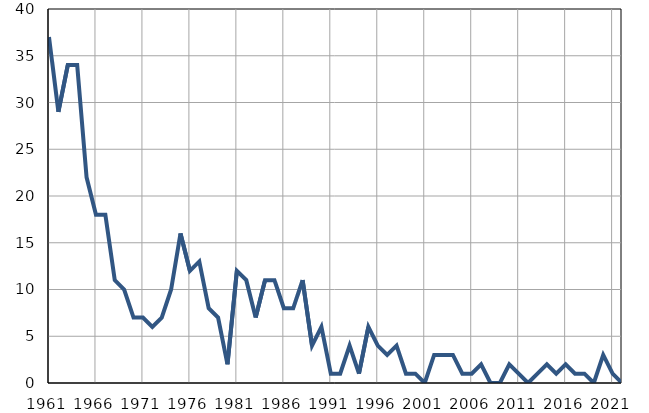
| Category | Умрла 
одојчад |
|---|---|
| 1961.0 | 37 |
| 1962.0 | 29 |
| 1963.0 | 34 |
| 1964.0 | 34 |
| 1965.0 | 22 |
| 1966.0 | 18 |
| 1967.0 | 18 |
| 1968.0 | 11 |
| 1969.0 | 10 |
| 1970.0 | 7 |
| 1971.0 | 7 |
| 1972.0 | 6 |
| 1973.0 | 7 |
| 1974.0 | 10 |
| 1975.0 | 16 |
| 1976.0 | 12 |
| 1977.0 | 13 |
| 1978.0 | 8 |
| 1979.0 | 7 |
| 1980.0 | 2 |
| 1981.0 | 12 |
| 1982.0 | 11 |
| 1983.0 | 7 |
| 1984.0 | 11 |
| 1985.0 | 11 |
| 1986.0 | 8 |
| 1987.0 | 8 |
| 1988.0 | 11 |
| 1989.0 | 4 |
| 1990.0 | 6 |
| 1991.0 | 1 |
| 1992.0 | 1 |
| 1993.0 | 4 |
| 1994.0 | 1 |
| 1995.0 | 6 |
| 1996.0 | 4 |
| 1997.0 | 3 |
| 1998.0 | 4 |
| 1999.0 | 1 |
| 2000.0 | 1 |
| 2001.0 | 0 |
| 2002.0 | 3 |
| 2003.0 | 3 |
| 2004.0 | 3 |
| 2005.0 | 1 |
| 2006.0 | 1 |
| 2007.0 | 2 |
| 2008.0 | 0 |
| 2009.0 | 0 |
| 2010.0 | 2 |
| 2011.0 | 1 |
| 2012.0 | 0 |
| 2013.0 | 1 |
| 2014.0 | 2 |
| 2015.0 | 1 |
| 2016.0 | 2 |
| 2017.0 | 1 |
| 2018.0 | 1 |
| 2019.0 | 0 |
| 2020.0 | 3 |
| 2021.0 | 1 |
| 2022.0 | 0 |